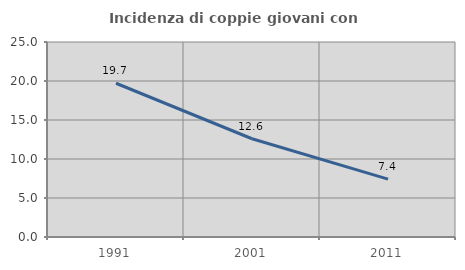
| Category | Incidenza di coppie giovani con figli |
|---|---|
| 1991.0 | 19.711 |
| 2001.0 | 12.595 |
| 2011.0 | 7.415 |